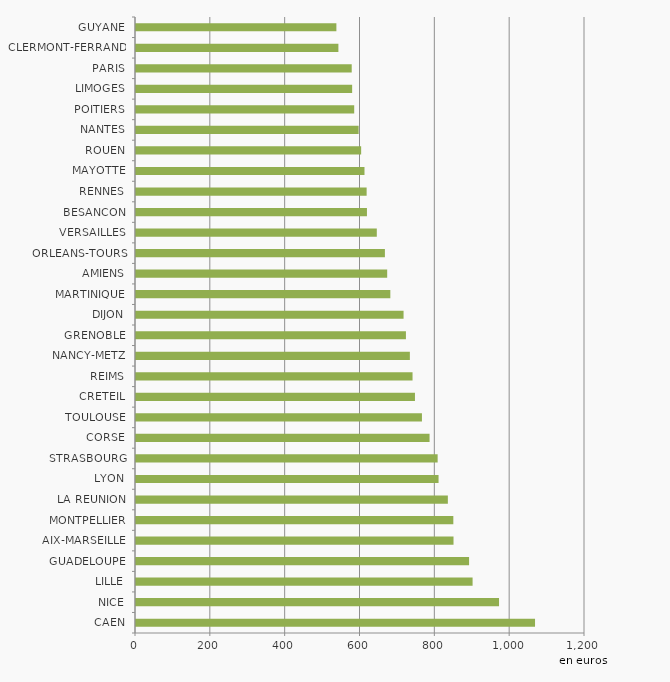
| Category | Programme 214 "Soutien à la politique de l'éducation nationale" |
|---|---|
| CAEN | 1069.129 |
| NICE | 972.902 |
| LILLE | 902.254 |
| GUADELOUPE | 892.857 |
| AIX-MARSEILLE | 851.256 |
| MONTPELLIER | 850.777 |
| LA REUNION | 836.145 |
| LYON | 811.292 |
| STRASBOURG | 808.841 |
| CORSE | 787.258 |
| TOULOUSE | 766.875 |
| CRETEIL | 748.225 |
| REIMS | 741.762 |
| NANCY-METZ | 734.61 |
| GRENOBLE | 724.078 |
| DIJON | 717.769 |
| MARTINIQUE | 682.4 |
| AMIENS | 674.003 |
| ORLEANS-TOURS | 667.899 |
| VERSAILLES | 646.241 |
| BESANCON | 619.902 |
| RENNES | 619.065 |
| MAYOTTE | 613.333 |
| ROUEN | 604.42 |
| NANTES | 597.716 |
| POITIERS | 585.844 |
| LIMOGES | 580.344 |
| PARIS | 579.185 |
| CLERMONT-FERRAND | 543.61 |
| GUYANE | 538.222 |